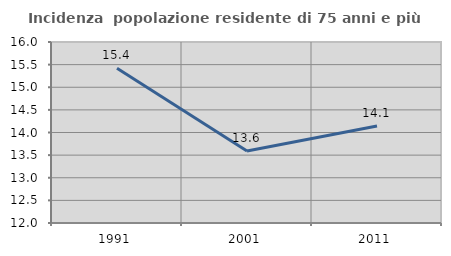
| Category | Incidenza  popolazione residente di 75 anni e più |
|---|---|
| 1991.0 | 15.418 |
| 2001.0 | 13.592 |
| 2011.0 | 14.144 |